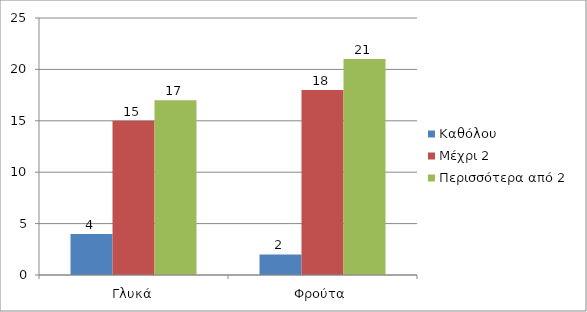
| Category | Καθόλου | Μέχρι 2 | Περισσότερα από 2 |
|---|---|---|---|
| Γλυκά | 4 | 15 | 17 |
| Φρούτα | 2 | 18 | 21 |